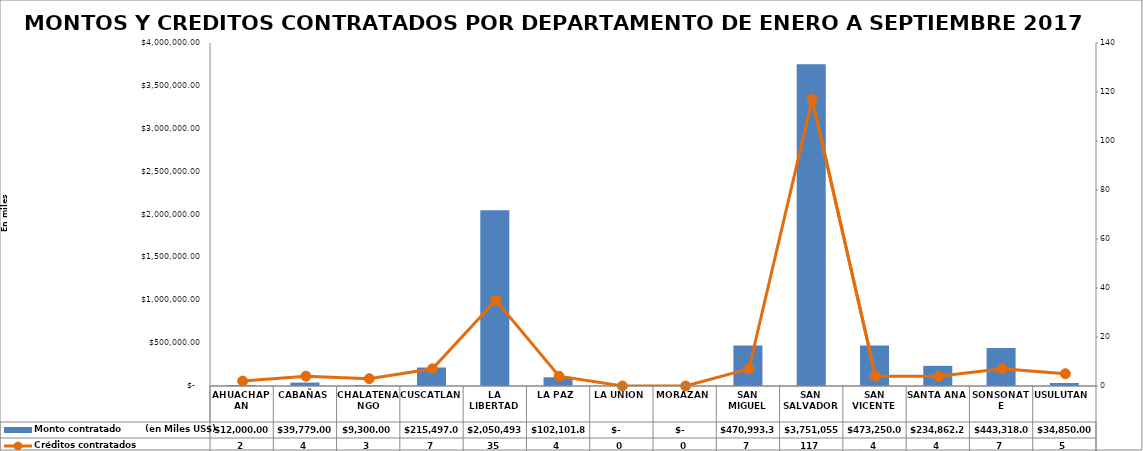
| Category | Monto contratado        (en Miles US$) |
|---|---|
| AHUACHAPAN | 12000 |
| CABAÑAS | 39779 |
| CHALATENANGO | 9300 |
| CUSCATLAN | 215497 |
| LA LIBERTAD | 2050493.95 |
| LA PAZ | 102101.87 |
| LA UNION | 0 |
| MORAZAN | 0 |
| SAN MIGUEL | 470993.3 |
| SAN SALVADOR | 3751055.63 |
| SAN VICENTE | 473250 |
| SANTA ANA | 234862.24 |
| SONSONATE | 443318 |
| USULUTAN | 34850 |